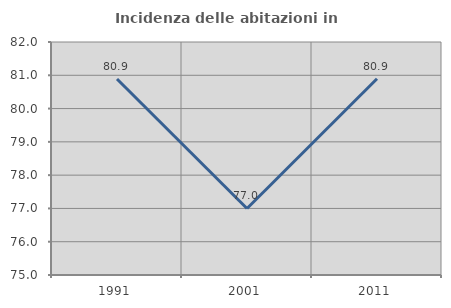
| Category | Incidenza delle abitazioni in proprietà  |
|---|---|
| 1991.0 | 80.89 |
| 2001.0 | 76.998 |
| 2011.0 | 80.894 |